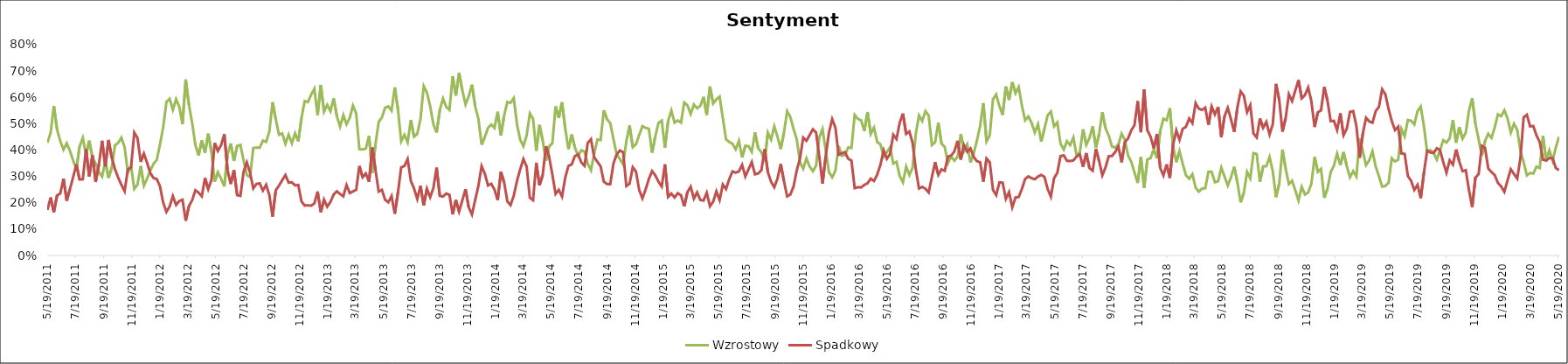
| Category | Wzrostowy | Spadkowy |
|---|---|---|
| 5/19/11 | 0.428 | 0.173 |
| 5/26/11 | 0.465 | 0.22 |
| 6/2/11 | 0.567 | 0.164 |
| 6/9/11 | 0.478 | 0.228 |
| 6/16/11 | 0.434 | 0.235 |
| 6/23/11 | 0.402 | 0.291 |
| 6/30/11 | 0.426 | 0.208 |
| 7/7/11 | 0.397 | 0.252 |
| 7/14/11 | 0.36 | 0.297 |
| 7/21/11 | 0.327 | 0.346 |
| 7/28/11 | 0.413 | 0.288 |
| 8/4/11 | 0.446 | 0.289 |
| 8/11/11 | 0.382 | 0.403 |
| 8/18/11 | 0.436 | 0.3 |
| 8/25/11 | 0.372 | 0.38 |
| 9/1/11 | 0.349 | 0.279 |
| 9/8/11 | 0.317 | 0.345 |
| 9/15/11 | 0.299 | 0.435 |
| 9/22/11 | 0.358 | 0.338 |
| 9/29/11 | 0.295 | 0.438 |
| 10/6/11 | 0.333 | 0.372 |
| 10/13/11 | 0.418 | 0.328 |
| 10/20/11 | 0.427 | 0.295 |
| 10/27/11 | 0.447 | 0.268 |
| 11/3/11 | 0.41 | 0.244 |
| 11/10/11 | 0.315 | 0.327 |
| 11/17/11 | 0.34 | 0.334 |
| 11/24/11 | 0.252 | 0.466 |
| 12/1/11 | 0.269 | 0.446 |
| 12/8/11 | 0.34 | 0.355 |
| 12/15/11 | 0.265 | 0.387 |
| 12/22/11 | 0.292 | 0.351 |
| 12/29/11 | 0.322 | 0.312 |
| 1/5/12 | 0.348 | 0.294 |
| 1/12/12 | 0.363 | 0.29 |
| 1/19/12 | 0.422 | 0.263 |
| 1/26/12 | 0.487 | 0.2 |
| 2/2/12 | 0.583 | 0.166 |
| 2/9/12 | 0.595 | 0.186 |
| 2/16/12 | 0.553 | 0.225 |
| 2/23/12 | 0.593 | 0.192 |
| 3/1/12 | 0.564 | 0.207 |
| 3/8/12 | 0.498 | 0.212 |
| 3/15/12 | 0.668 | 0.132 |
| 3/22/12 | 0.571 | 0.187 |
| 3/29/12 | 0.503 | 0.21 |
| 4/5/12 | 0.419 | 0.248 |
| 4/12/12 | 0.379 | 0.238 |
| 4/19/12 | 0.436 | 0.225 |
| 4/26/12 | 0.39 | 0.294 |
| 5/3/12 | 0.462 | 0.252 |
| 5/10/12 | 0.393 | 0.286 |
| 5/17/12 | 0.28 | 0.427 |
| 5/24/12 | 0.316 | 0.397 |
| 5/31/12 | 0.291 | 0.419 |
| 6/7/12 | 0.262 | 0.46 |
| 6/14/12 | 0.382 | 0.324 |
| 6/21/12 | 0.425 | 0.271 |
| 6/28/12 | 0.359 | 0.324 |
| 7/5/12 | 0.415 | 0.229 |
| 7/12/12 | 0.42 | 0.226 |
| 7/19/12 | 0.36 | 0.318 |
| 7/26/12 | 0.305 | 0.353 |
| 8/2/12 | 0.297 | 0.314 |
| 8/9/12 | 0.408 | 0.255 |
| 8/16/12 | 0.409 | 0.272 |
| 8/23/12 | 0.409 | 0.274 |
| 8/30/12 | 0.436 | 0.246 |
| 9/6/12 | 0.431 | 0.268 |
| 9/13/12 | 0.47 | 0.229 |
| 9/20/12 | 0.582 | 0.147 |
| 9/27/12 | 0.517 | 0.247 |
| 10/4/12 | 0.458 | 0.265 |
| 10/11/12 | 0.463 | 0.286 |
| 10/18/12 | 0.424 | 0.305 |
| 10/25/12 | 0.458 | 0.277 |
| 11/1/12 | 0.426 | 0.278 |
| 11/8/12 | 0.464 | 0.266 |
| 11/15/12 | 0.433 | 0.267 |
| 11/22/12 | 0.522 | 0.205 |
| 11/29/12 | 0.586 | 0.189 |
| 12/6/12 | 0.582 | 0.19 |
| 12/13/12 | 0.61 | 0.189 |
| 12/20/12 | 0.632 | 0.198 |
| 12/27/12 | 0.533 | 0.243 |
| 1/3/13 | 0.647 | 0.165 |
| 1/10/13 | 0.545 | 0.212 |
| 1/17/13 | 0.571 | 0.185 |
| 1/24/13 | 0.548 | 0.203 |
| 1/31/13 | 0.596 | 0.231 |
| 2/7/13 | 0.528 | 0.243 |
| 2/14/13 | 0.489 | 0.233 |
| 2/21/13 | 0.533 | 0.225 |
| 2/28/13 | 0.498 | 0.267 |
| 3/7/13 | 0.522 | 0.237 |
| 3/14/13 | 0.569 | 0.243 |
| 3/21/13 | 0.539 | 0.249 |
| 3/28/13 | 0.403 | 0.34 |
| 4/4/13 | 0.402 | 0.297 |
| 4/11/13 | 0.406 | 0.311 |
| 4/18/13 | 0.453 | 0.28 |
| 4/25/13 | 0.313 | 0.41 |
| 5/2/13 | 0.422 | 0.325 |
| 5/9/13 | 0.507 | 0.242 |
| 5/16/13 | 0.524 | 0.249 |
| 5/23/13 | 0.561 | 0.212 |
| 5/30/13 | 0.566 | 0.202 |
| 6/6/13 | 0.549 | 0.225 |
| 6/13/13 | 0.638 | 0.158 |
| 6/20/13 | 0.553 | 0.24 |
| 6/27/13 | 0.433 | 0.335 |
| 7/4/13 | 0.458 | 0.34 |
| 7/11/13 | 0.429 | 0.366 |
| 7/18/13 | 0.514 | 0.283 |
| 7/25/13 | 0.451 | 0.254 |
| 8/1/13 | 0.462 | 0.214 |
| 8/8/13 | 0.519 | 0.265 |
| 8/15/13 | 0.642 | 0.19 |
| 8/22/13 | 0.618 | 0.253 |
| 8/29/13 | 0.567 | 0.221 |
| 9/5/13 | 0.498 | 0.255 |
| 9/12/13 | 0.467 | 0.333 |
| 9/19/13 | 0.552 | 0.226 |
| 9/26/13 | 0.595 | 0.224 |
| 10/3/13 | 0.564 | 0.235 |
| 10/10/13 | 0.552 | 0.23 |
| 10/17/13 | 0.68 | 0.156 |
| 10/24/13 | 0.607 | 0.211 |
| 10/31/13 | 0.693 | 0.167 |
| 11/7/13 | 0.627 | 0.209 |
| 11/14/13 | 0.573 | 0.252 |
| 11/21/13 | 0.604 | 0.182 |
| 11/28/13 | 0.648 | 0.155 |
| 12/5/13 | 0.566 | 0.211 |
| 12/12/13 | 0.519 | 0.264 |
| 12/19/13 | 0.42 | 0.339 |
| 12/26/13 | 0.45 | 0.31 |
| 1/2/14 | 0.484 | 0.266 |
| 1/9/14 | 0.497 | 0.272 |
| 1/16/14 | 0.484 | 0.25 |
| 1/23/14 | 0.545 | 0.21 |
| 1/30/14 | 0.455 | 0.317 |
| 2/6/14 | 0.531 | 0.278 |
| 2/13/14 | 0.582 | 0.205 |
| 2/20/14 | 0.579 | 0.191 |
| 2/27/14 | 0.597 | 0.227 |
| 3/6/14 | 0.498 | 0.283 |
| 3/13/14 | 0.439 | 0.327 |
| 3/20/14 | 0.415 | 0.366 |
| 3/27/14 | 0.455 | 0.337 |
| 4/3/14 | 0.539 | 0.219 |
| 4/10/14 | 0.519 | 0.21 |
| 4/17/14 | 0.397 | 0.352 |
| 4/24/14 | 0.495 | 0.266 |
| 5/1/14 | 0.437 | 0.306 |
| 5/8/14 | 0.359 | 0.415 |
| 5/15/14 | 0.414 | 0.374 |
| 5/22/14 | 0.425 | 0.307 |
| 5/29/14 | 0.566 | 0.234 |
| 6/5/14 | 0.522 | 0.249 |
| 6/12/14 | 0.581 | 0.224 |
| 6/19/14 | 0.482 | 0.295 |
| 6/26/14 | 0.403 | 0.34 |
| 7/3/14 | 0.459 | 0.345 |
| 7/10/14 | 0.41 | 0.377 |
| 7/17/14 | 0.379 | 0.383 |
| 7/24/14 | 0.399 | 0.353 |
| 7/31/14 | 0.394 | 0.34 |
| 8/7/14 | 0.348 | 0.427 |
| 8/14/14 | 0.324 | 0.441 |
| 8/21/14 | 0.386 | 0.373 |
| 8/28/14 | 0.44 | 0.356 |
| 9/4/14 | 0.438 | 0.338 |
| 9/11/14 | 0.551 | 0.28 |
| 9/18/14 | 0.516 | 0.271 |
| 9/25/14 | 0.502 | 0.271 |
| 10/2/14 | 0.441 | 0.349 |
| 10/9/14 | 0.383 | 0.383 |
| 10/16/14 | 0.366 | 0.398 |
| 10/23/14 | 0.345 | 0.392 |
| 10/30/14 | 0.433 | 0.264 |
| 11/6/14 | 0.494 | 0.272 |
| 11/13/14 | 0.411 | 0.335 |
| 11/20/14 | 0.422 | 0.319 |
| 11/27/14 | 0.457 | 0.248 |
| 12/4/14 | 0.49 | 0.217 |
| 12/11/14 | 0.484 | 0.251 |
| 12/18/14 | 0.481 | 0.29 |
| 12/25/14 | 0.39 | 0.32 |
| 1/1/15 | 0.451 | 0.304 |
| 1/8/15 | 0.503 | 0.28 |
| 1/15/15 | 0.512 | 0.262 |
| 1/22/15 | 0.409 | 0.346 |
| 1/29/15 | 0.511 | 0.222 |
| 2/5/15 | 0.55 | 0.235 |
| 2/12/15 | 0.504 | 0.22 |
| 2/19/15 | 0.512 | 0.236 |
| 2/26/15 | 0.504 | 0.228 |
| 3/5/15 | 0.581 | 0.186 |
| 3/12/15 | 0.57 | 0.241 |
| 3/19/15 | 0.537 | 0.261 |
| 3/26/15 | 0.573 | 0.216 |
| 4/2/15 | 0.559 | 0.239 |
| 4/9/15 | 0.568 | 0.211 |
| 4/16/15 | 0.602 | 0.208 |
| 4/23/15 | 0.533 | 0.238 |
| 4/30/15 | 0.641 | 0.187 |
| 5/7/15 | 0.577 | 0.204 |
| 5/14/15 | 0.593 | 0.243 |
| 5/21/15 | 0.603 | 0.21 |
| 5/28/15 | 0.521 | 0.269 |
| 6/4/15 | 0.44 | 0.252 |
| 6/11/15 | 0.431 | 0.29 |
| 6/18/15 | 0.424 | 0.319 |
| 6/25/15 | 0.403 | 0.314 |
| 7/2/15 | 0.435 | 0.319 |
| 7/9/15 | 0.372 | 0.344 |
| 7/16/15 | 0.416 | 0.3 |
| 7/23/15 | 0.415 | 0.327 |
| 7/30/15 | 0.393 | 0.354 |
| 8/6/15 | 0.467 | 0.308 |
| 8/13/15 | 0.407 | 0.311 |
| 8/20/15 | 0.392 | 0.324 |
| 8/27/15 | 0.357 | 0.403 |
| 9/3/15 | 0.466 | 0.316 |
| 9/10/15 | 0.44 | 0.28 |
| 9/17/15 | 0.49 | 0.259 |
| 9/24/15 | 0.451 | 0.292 |
| 10/1/15 | 0.404 | 0.347 |
| 10/8/15 | 0.466 | 0.283 |
| 10/15/15 | 0.547 | 0.224 |
| 10/22/15 | 0.525 | 0.231 |
| 10/29/15 | 0.479 | 0.262 |
| 11/5/15 | 0.44 | 0.324 |
| 11/12/15 | 0.354 | 0.369 |
| 11/19/15 | 0.329 | 0.447 |
| 11/26/15 | 0.369 | 0.435 |
| 12/3/15 | 0.337 | 0.457 |
| 12/10/15 | 0.32 | 0.478 |
| 12/17/15 | 0.341 | 0.466 |
| 12/24/15 | 0.449 | 0.374 |
| 12/31/15 | 0.479 | 0.273 |
| 1/7/16 | 0.398 | 0.378 |
| 1/14/16 | 0.317 | 0.466 |
| 1/21/16 | 0.297 | 0.517 |
| 1/28/16 | 0.322 | 0.485 |
| 2/4/16 | 0.415 | 0.382 |
| 2/11/16 | 0.378 | 0.388 |
| 2/18/16 | 0.381 | 0.392 |
| 2/25/16 | 0.41 | 0.367 |
| 3/3/16 | 0.408 | 0.36 |
| 3/10/16 | 0.533 | 0.256 |
| 3/17/16 | 0.518 | 0.259 |
| 3/24/16 | 0.513 | 0.258 |
| 3/31/16 | 0.472 | 0.268 |
| 4/7/16 | 0.544 | 0.274 |
| 4/14/16 | 0.461 | 0.292 |
| 4/21/16 | 0.485 | 0.283 |
| 4/28/16 | 0.43 | 0.307 |
| 5/5/16 | 0.422 | 0.343 |
| 5/12/16 | 0.375 | 0.399 |
| 5/19/16 | 0.392 | 0.367 |
| 5/26/16 | 0.411 | 0.386 |
| 6/2/16 | 0.349 | 0.458 |
| 6/9/16 | 0.355 | 0.442 |
| 6/16/16 | 0.302 | 0.504 |
| 6/23/16 | 0.278 | 0.538 |
| 6/30/16 | 0.337 | 0.461 |
| 7/7/16 | 0.305 | 0.471 |
| 7/14/16 | 0.333 | 0.428 |
| 7/21/16 | 0.462 | 0.327 |
| 7/28/16 | 0.531 | 0.254 |
| 8/4/16 | 0.51 | 0.26 |
| 8/11/16 | 0.548 | 0.253 |
| 8/18/16 | 0.531 | 0.239 |
| 8/25/16 | 0.419 | 0.297 |
| 9/1/16 | 0.429 | 0.354 |
| 9/8/16 | 0.504 | 0.306 |
| 9/15/16 | 0.424 | 0.327 |
| 9/22/16 | 0.412 | 0.321 |
| 9/29/16 | 0.351 | 0.375 |
| 10/6/16 | 0.375 | 0.379 |
| 10/13/16 | 0.36 | 0.395 |
| 10/20/16 | 0.375 | 0.435 |
| 10/27/16 | 0.461 | 0.364 |
| 11/3/16 | 0.396 | 0.419 |
| 11/10/16 | 0.421 | 0.394 |
| 11/17/16 | 0.353 | 0.406 |
| 11/24/16 | 0.387 | 0.374 |
| 12/1/16 | 0.436 | 0.358 |
| 12/8/16 | 0.491 | 0.354 |
| 12/15/16 | 0.578 | 0.28 |
| 12/22/16 | 0.433 | 0.368 |
| 12/29/16 | 0.455 | 0.354 |
| 1/5/17 | 0.593 | 0.249 |
| 1/12/17 | 0.611 | 0.229 |
| 1/19/17 | 0.566 | 0.277 |
| 1/26/17 | 0.533 | 0.277 |
| 2/2/17 | 0.641 | 0.215 |
| 2/9/17 | 0.59 | 0.24 |
| 2/16/17 | 0.658 | 0.183 |
| 2/23/17 | 0.616 | 0.22 |
| 3/2/17 | 0.639 | 0.222 |
| 3/9/17 | 0.568 | 0.253 |
| 3/16/17 | 0.513 | 0.29 |
| 3/23/17 | 0.528 | 0.3 |
| 3/30/17 | 0.503 | 0.293 |
| 4/6/17 | 0.467 | 0.289 |
| 4/13/17 | 0.498 | 0.3 |
| 4/20/17 | 0.432 | 0.306 |
| 4/27/17 | 0.481 | 0.298 |
| 5/4/17 | 0.532 | 0.252 |
| 5/11/17 | 0.546 | 0.223 |
| 5/18/17 | 0.49 | 0.294 |
| 5/25/17 | 0.505 | 0.314 |
| 6/1/17 | 0.425 | 0.377 |
| 6/8/17 | 0.402 | 0.38 |
| 6/15/17 | 0.434 | 0.359 |
| 6/22/17 | 0.419 | 0.358 |
| 6/29/17 | 0.447 | 0.361 |
| 7/6/17 | 0.379 | 0.375 |
| 7/13/17 | 0.391 | 0.384 |
| 7/20/17 | 0.479 | 0.336 |
| 7/27/17 | 0.42 | 0.389 |
| 8/3/17 | 0.445 | 0.332 |
| 8/10/17 | 0.49 | 0.322 |
| 8/17/17 | 0.409 | 0.405 |
| 8/24/17 | 0.46 | 0.358 |
| 8/31/17 | 0.544 | 0.304 |
| 9/7/17 | 0.482 | 0.335 |
| 9/14/17 | 0.455 | 0.377 |
| 9/21/17 | 0.413 | 0.378 |
| 9/28/17 | 0.409 | 0.392 |
| 10/5/17 | 0.422 | 0.414 |
| 10/12/17 | 0.462 | 0.353 |
| 10/19/17 | 0.439 | 0.43 |
| 10/26/17 | 0.379 | 0.444 |
| 11/2/17 | 0.355 | 0.475 |
| 11/9/17 | 0.315 | 0.494 |
| 11/16/17 | 0.275 | 0.586 |
| 11/23/17 | 0.375 | 0.467 |
| 11/30/17 | 0.257 | 0.63 |
| 12/7/17 | 0.364 | 0.475 |
| 12/14/17 | 0.369 | 0.451 |
| 12/21/17 | 0.403 | 0.407 |
| 12/28/17 | 0.368 | 0.461 |
| 1/4/18 | 0.473 | 0.332 |
| 1/11/18 | 0.519 | 0.304 |
| 1/18/18 | 0.513 | 0.346 |
| 1/25/18 | 0.559 | 0.294 |
| 2/1/18 | 0.412 | 0.421 |
| 2/8/18 | 0.354 | 0.474 |
| 2/15/18 | 0.396 | 0.439 |
| 2/22/18 | 0.347 | 0.481 |
| 3/1/18 | 0.305 | 0.488 |
| 3/8/18 | 0.291 | 0.52 |
| 3/15/18 | 0.308 | 0.502 |
| 3/22/18 | 0.257 | 0.578 |
| 3/29/18 | 0.242 | 0.557 |
| 4/5/18 | 0.254 | 0.552 |
| 4/12/18 | 0.255 | 0.561 |
| 4/19/18 | 0.318 | 0.496 |
| 4/26/18 | 0.317 | 0.565 |
| 5/3/18 | 0.278 | 0.535 |
| 5/10/18 | 0.282 | 0.564 |
| 5/17/18 | 0.333 | 0.449 |
| 5/24/18 | 0.299 | 0.529 |
| 5/31/18 | 0.266 | 0.56 |
| 6/7/18 | 0.297 | 0.517 |
| 6/14/18 | 0.336 | 0.469 |
| 6/21/18 | 0.277 | 0.562 |
| 6/28/18 | 0.202 | 0.622 |
| 7/5/18 | 0.238 | 0.606 |
| 7/12/18 | 0.317 | 0.543 |
| 7/19/18 | 0.293 | 0.57 |
| 7/26/18 | 0.388 | 0.463 |
| 8/2/18 | 0.385 | 0.448 |
| 8/9/18 | 0.279 | 0.52 |
| 8/16/18 | 0.338 | 0.484 |
| 8/23/18 | 0.339 | 0.507 |
| 8/30/18 | 0.374 | 0.46 |
| 9/6/18 | 0.32 | 0.498 |
| 9/13/18 | 0.221 | 0.651 |
| 9/20/18 | 0.273 | 0.59 |
| 9/27/18 | 0.402 | 0.47 |
| 10/4/18 | 0.329 | 0.521 |
| 10/11/18 | 0.271 | 0.612 |
| 10/18/18 | 0.284 | 0.585 |
| 10/25/18 | 0.247 | 0.626 |
| 11/1/18 | 0.209 | 0.665 |
| 11/8/18 | 0.26 | 0.596 |
| 11/15/18 | 0.231 | 0.609 |
| 11/22/18 | 0.239 | 0.637 |
| 11/29/18 | 0.272 | 0.585 |
| 12/6/18 | 0.374 | 0.487 |
| 12/13/18 | 0.317 | 0.543 |
| 12/20/18 | 0.328 | 0.551 |
| 12/27/18 | 0.219 | 0.639 |
| 1/3/19 | 0.253 | 0.588 |
| 1/10/19 | 0.316 | 0.51 |
| 1/17/19 | 0.341 | 0.511 |
| 1/24/19 | 0.387 | 0.476 |
| 1/31/19 | 0.343 | 0.539 |
| 2/7/19 | 0.392 | 0.457 |
| 2/14/19 | 0.339 | 0.481 |
| 2/21/19 | 0.297 | 0.545 |
| 2/28/19 | 0.32 | 0.548 |
| 3/7/19 | 0.3 | 0.491 |
| 3/14/19 | 0.444 | 0.371 |
| 3/21/19 | 0.394 | 0.463 |
| 3/28/19 | 0.343 | 0.522 |
| 4/4/19 | 0.361 | 0.508 |
| 4/11/19 | 0.396 | 0.504 |
| 4/18/19 | 0.337 | 0.548 |
| 4/25/19 | 0.301 | 0.564 |
| 5/2/19 | 0.261 | 0.631 |
| 5/9/19 | 0.264 | 0.612 |
| 5/16/19 | 0.276 | 0.556 |
| 5/23/19 | 0.369 | 0.51 |
| 5/30/19 | 0.357 | 0.476 |
| 6/6/19 | 0.364 | 0.489 |
| 6/13/19 | 0.48 | 0.387 |
| 6/20/19 | 0.453 | 0.385 |
| 6/27/19 | 0.514 | 0.302 |
| 7/4/19 | 0.511 | 0.283 |
| 7/11/19 | 0.497 | 0.249 |
| 7/18/19 | 0.547 | 0.268 |
| 7/25/19 | 0.565 | 0.217 |
| 8/1/19 | 0.49 | 0.315 |
| 8/8/19 | 0.393 | 0.398 |
| 8/15/19 | 0.4 | 0.391 |
| 8/22/19 | 0.389 | 0.389 |
| 8/29/19 | 0.364 | 0.407 |
| 9/5/19 | 0.4 | 0.4 |
| 9/12/19 | 0.438 | 0.354 |
| 9/19/19 | 0.429 | 0.314 |
| 9/26/19 | 0.444 | 0.361 |
| 10/3/19 | 0.514 | 0.345 |
| 10/10/19 | 0.428 | 0.402 |
| 10/17/19 | 0.487 | 0.356 |
| 10/24/19 | 0.443 | 0.32 |
| 10/31/19 | 0.466 | 0.324 |
| 11/7/19 | 0.549 | 0.249 |
| 11/14/19 | 0.597 | 0.183 |
| 11/21/19 | 0.5 | 0.295 |
| 11/28/19 | 0.441 | 0.309 |
| 12/5/19 | 0.379 | 0.416 |
| 12/12/19 | 0.435 | 0.408 |
| 12/19/19 | 0.462 | 0.33 |
| 12/26/19 | 0.446 | 0.317 |
| 1/2/20 | 0.486 | 0.305 |
| 1/9/20 | 0.536 | 0.276 |
| 1/16/20 | 0.528 | 0.262 |
| 1/23/20 | 0.551 | 0.242 |
| 1/30/20 | 0.519 | 0.286 |
| 2/6/20 | 0.466 | 0.327 |
| 2/13/20 | 0.5 | 0.309 |
| 2/20/20 | 0.477 | 0.292 |
| 2/27/20 | 0.396 | 0.37 |
| 3/5/20 | 0.354 | 0.524 |
| 3/12/20 | 0.304 | 0.534 |
| 3/19/20 | 0.313 | 0.49 |
| 3/26/20 | 0.311 | 0.491 |
| 4/2/20 | 0.337 | 0.455 |
| 4/9/20 | 0.332 | 0.43 |
| 4/16/20 | 0.455 | 0.364 |
| 4/23/20 | 0.36 | 0.36 |
| 4/30/20 | 0.399 | 0.37 |
| 5/7/20 | 0.36 | 0.369 |
| 5/14/20 | 0.41 | 0.332 |
| 5/21/20 | 0.451 | 0.324 |